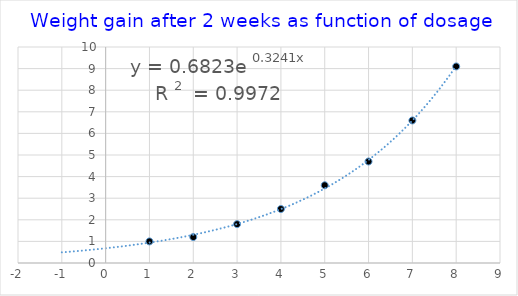
| Category | Series 0 |
|---|---|
| 1.0 | 1 |
| 2.0 | 1.2 |
| 3.0 | 1.8 |
| 4.0 | 2.5 |
| 5.0 | 3.6 |
| 6.0 | 4.7 |
| 7.0 | 6.6 |
| 8.0 | 9.1 |